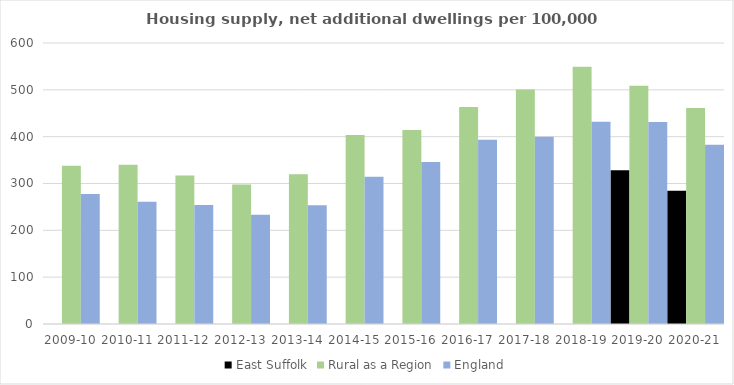
| Category | East Suffolk | Rural as a Region | England |
|---|---|---|---|
| 2009-10 | 0 | 337.852 | 277.548 |
| 2010-11 | 0 | 340.105 | 260.994 |
| 2011-12 | 0 | 317.04 | 254.007 |
| 2012-13 | 0 | 297.763 | 233.153 |
| 2013-14 | 0 | 319.835 | 253.602 |
| 2014-15 | 0 | 403.796 | 314.256 |
| 2015-16 | 0 | 414.091 | 346.154 |
| 2016-17 | 0 | 463.209 | 393.256 |
| 2017-18 | 0 | 500.68 | 399.646 |
| 2018-19 | 0 | 549.491 | 432.099 |
| 2019-20 | 328.308 | 508.493 | 431.187 |
| 2020-21 | 284.376 | 461.114 | 382.827 |